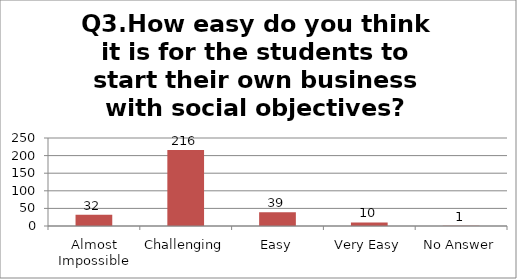
| Category | Q3.How easy do you think it is for the students to start their own business with social objectives? |
|---|---|
| Almost Impossible | 32 |
| Challenging | 216 |
| Easy | 39 |
| Very Easy | 10 |
| No Answer | 1 |